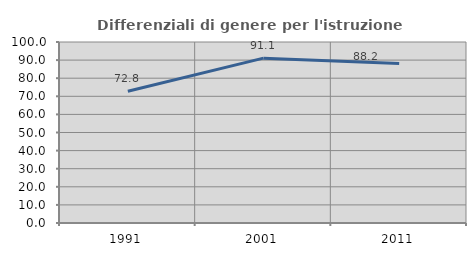
| Category | Differenziali di genere per l'istruzione superiore |
|---|---|
| 1991.0 | 72.756 |
| 2001.0 | 91.086 |
| 2011.0 | 88.167 |